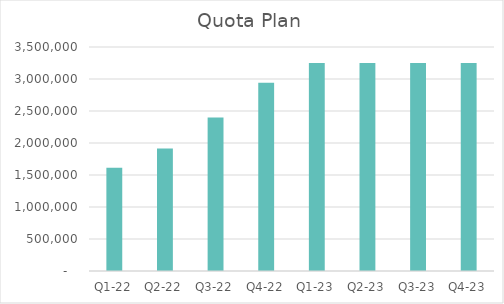
| Category | Quota Plan |
|---|---|
| Q1-22 | 1614525 |
| Q2-22 | 1914250 |
| Q3-22 | 2399700 |
| Q4-22 | 2941200 |
| Q1-23 | 3249000 |
| Q2-23 | 3249000 |
| Q3-23 | 3249000 |
| Q4-23 | 3249000 |